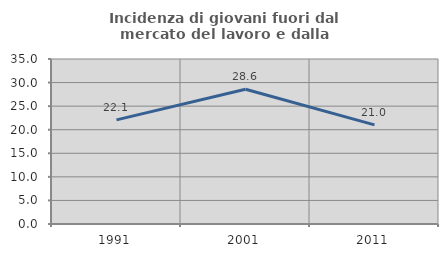
| Category | Incidenza di giovani fuori dal mercato del lavoro e dalla formazione  |
|---|---|
| 1991.0 | 22.079 |
| 2001.0 | 28.591 |
| 2011.0 | 21.038 |